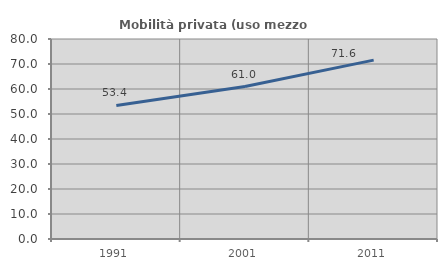
| Category | Mobilità privata (uso mezzo privato) |
|---|---|
| 1991.0 | 53.425 |
| 2001.0 | 60.991 |
| 2011.0 | 71.554 |